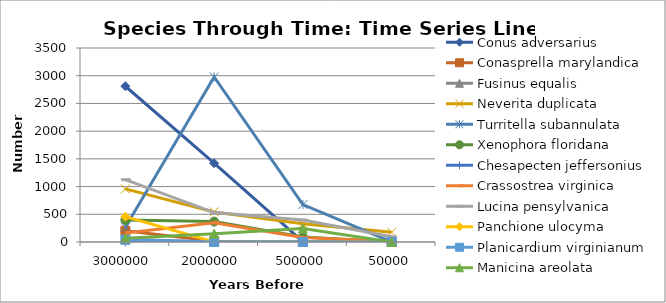
| Category | Conus adversarius | Conasprella marylandica | Fusinus equalis | Neverita duplicata | Turritella subannulata | Xenophora floridana | Chesapecten jeffersonius | Crassostrea virginica | Lucina pensylvanica | Panchione ulocyma | Planicardium virginianum | Manicina areolata |
|---|---|---|---|---|---|---|---|---|---|---|---|---|
| 3000000.0 | 2810 | 202 | 50 | 958 | 267 | 399 | 2 | 164 | 1124 | 457 | 41 | 68 |
| 2000000.0 | 1421 | 15 | 0 | 543 | 2977 | 368 | 2 | 348 | 531 | 1 | 0 | 149 |
| 500000.0 | 5 | 0 | 0 | 331 | 675 | 89 | 0 | 82 | 395 | 0 | 0 | 244 |
| 50000.0 | 0 | 0 | 0 | 176 | 2 | 0 | 0 | 7 | 93 | 0 | 0 | 0 |